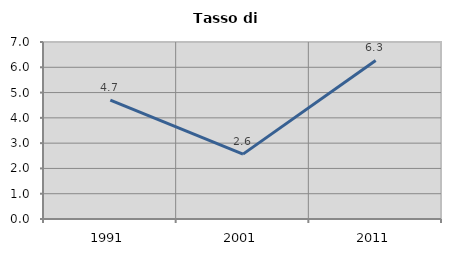
| Category | Tasso di disoccupazione   |
|---|---|
| 1991.0 | 4.699 |
| 2001.0 | 2.566 |
| 2011.0 | 6.27 |